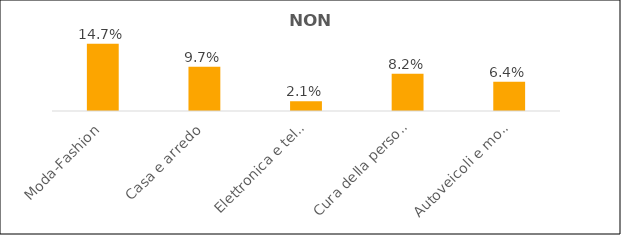
| Category | Series 0 |
|---|---|
| Moda-Fashion | 0.147 |
| Casa e arredo | 0.097 |
| Elettronica e telecomunicazioni | 0.021 |
| Cura della persona, sport e tempo libero | 0.082 |
| Autoveicoli e motocicli | 0.064 |